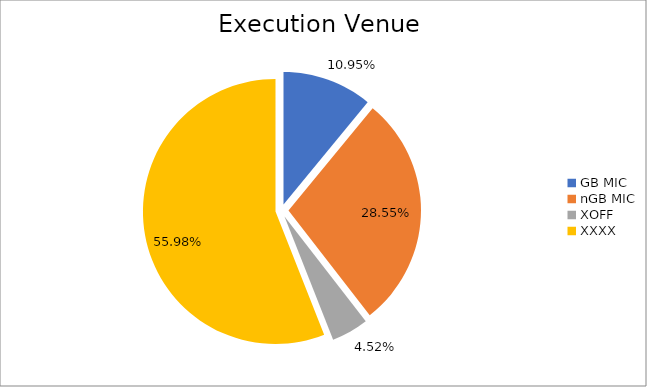
| Category | Series 0 |
|---|---|
| GB MIC | 1094826.276 |
| nGB MIC | 2854368.402 |
| XOFF | 451884.39 |
| XXXX | 5597814.018 |